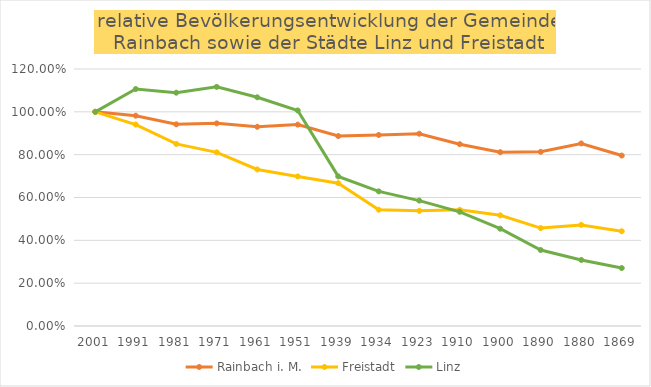
| Category | Rainbach i. M. | Freistadt | Linz |
|---|---|---|---|
| 2001 | 1 | 1 | 1 |
| 1991 | 0.982 | 0.941 | 1.106 |
| 1981 | 0.942 | 0.85 | 1.089 |
| 1971 | 0.946 | 0.811 | 1.117 |
| 1961 | 0.93 | 0.731 | 1.068 |
| 1951 | 0.94 | 0.698 | 1.006 |
| 1939 | 0.887 | 0.667 | 0.698 |
| 1934 | 0.892 | 0.543 | 0.629 |
| 1923 | 0.898 | 0.538 | 0.586 |
| 1910 | 0.849 | 0.542 | 0.533 |
| 1900 | 0.812 | 0.517 | 0.454 |
| 1890 | 0.813 | 0.457 | 0.355 |
| 1880 | 0.852 | 0.472 | 0.308 |
| 1869 | 0.796 | 0.442 | 0.27 |